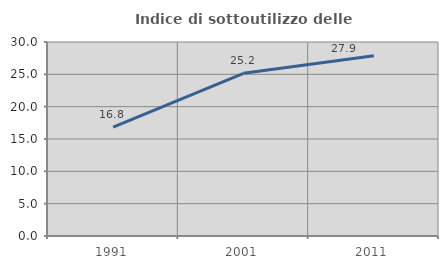
| Category | Indice di sottoutilizzo delle abitazioni  |
|---|---|
| 1991.0 | 16.842 |
| 2001.0 | 25.154 |
| 2011.0 | 27.876 |